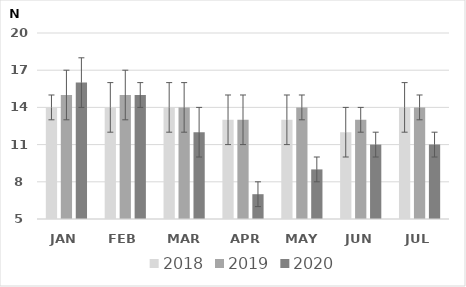
| Category | 2018 | 2019 | 2020 |
|---|---|---|---|
| JAN | 14 | 15 | 16 |
| FEB | 14 | 15 | 15 |
| MAR | 14 | 14 | 12 |
| APR | 13 | 13 | 7 |
| MAY | 13 | 14 | 9 |
| JUN | 12 | 13 | 11 |
| JUL | 14 | 14 | 11 |